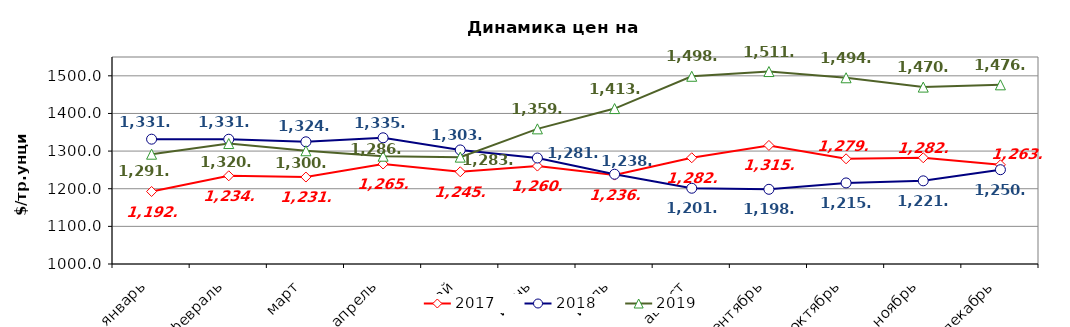
| Category | 2017 | 2018 | 2019 |
|---|---|---|---|
| январь | 1192.62 | 1331.67 | 1291.75 |
| февраль | 1234.33 | 1331.53 | 1320.065 |
| март | 1231.07 | 1324.66 | 1300.87 |
| апрель | 1265.63 | 1335.34 | 1286.445 |
| май | 1245 | 1303.03 | 1283.948 |
| июнь | 1260.22 | 1281.57 | 1359.042 |
| июль | 1236.22 | 1238.53 | 1412.978 |
| август | 1282.3 | 1201.3 | 1498.798 |
| сентябрь | 1314.98 | 1198.47 | 1511.314 |
| октябрь | 1279.51 | 1215.39 | 1494.8 |
| ноябрь | 1282.28 | 1220.95 | 1470.017 |
| декабрь | 1263.54 | 1250.56 | 1476.04 |